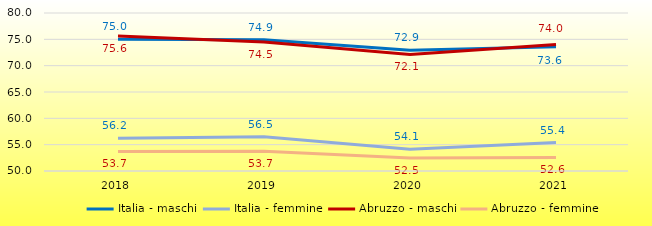
| Category | Italia - maschi | Italia - femmine | Abruzzo - maschi | Abruzzo - femmine |
|---|---|---|---|---|
| 2018 | 75.013 | 56.224 | 75.616 | 53.706 |
| 2019 | 74.928 | 56.515 | 74.479 | 53.748 |
| 2020 | 72.947 | 54.147 | 72.142 | 52.476 |
| 2021 | 73.612 | 55.392 | 74.024 | 52.58 |